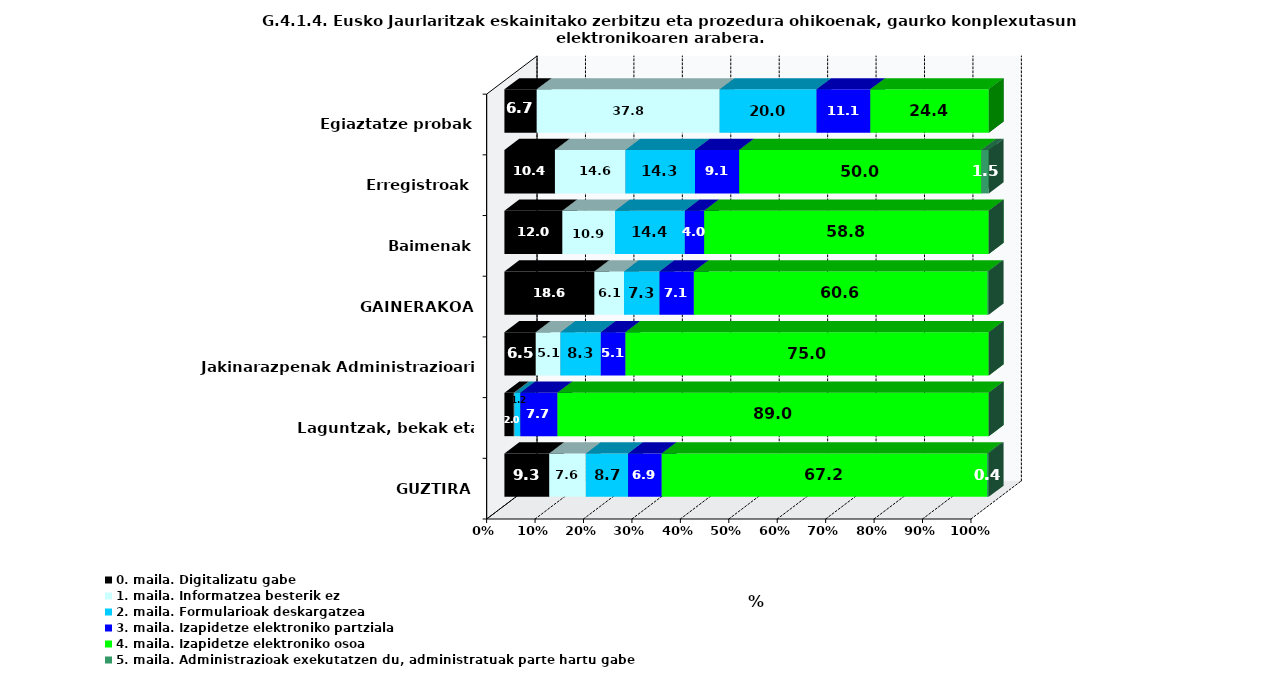
| Category | 0. maila. Digitalizatu gabe | 1. maila. Informatzea besterik ez | 2. maila. Formularioak deskargatzea | 3. maila. Izapidetze elektroniko partziala | 4. maila. Izapidetze elektroniko osoa | 5. maila. Administrazioak exekutatzen du, administratuak parte hartu gabe |
|---|---|---|---|---|---|---|
| GUZTIRA | 9.257 | 7.566 | 8.723 | 6.943 | 67.156 | 0.356 |
| Laguntzak, bekak eta diru-laguntzak | 1.952 | 0.15 | 1.201 | 7.658 | 89.039 | 0 |
| Jakinarazpenak Administrazioari | 6.481 | 5.093 | 8.333 | 5.093 | 75 | 0 |
| GAINERAKOA | 18.582 | 6.112 | 7.335 | 7.09 | 60.636 | 0.244 |
| Baimenak | 11.973 | 10.865 | 14.412 | 3.991 | 58.758 | 0 |
| Erregistroak | 10.435 | 14.565 | 14.348 | 9.13 | 50 | 1.522 |
| Egiaztatze probak | 6.667 | 37.778 | 20 | 11.111 | 24.444 | 0 |